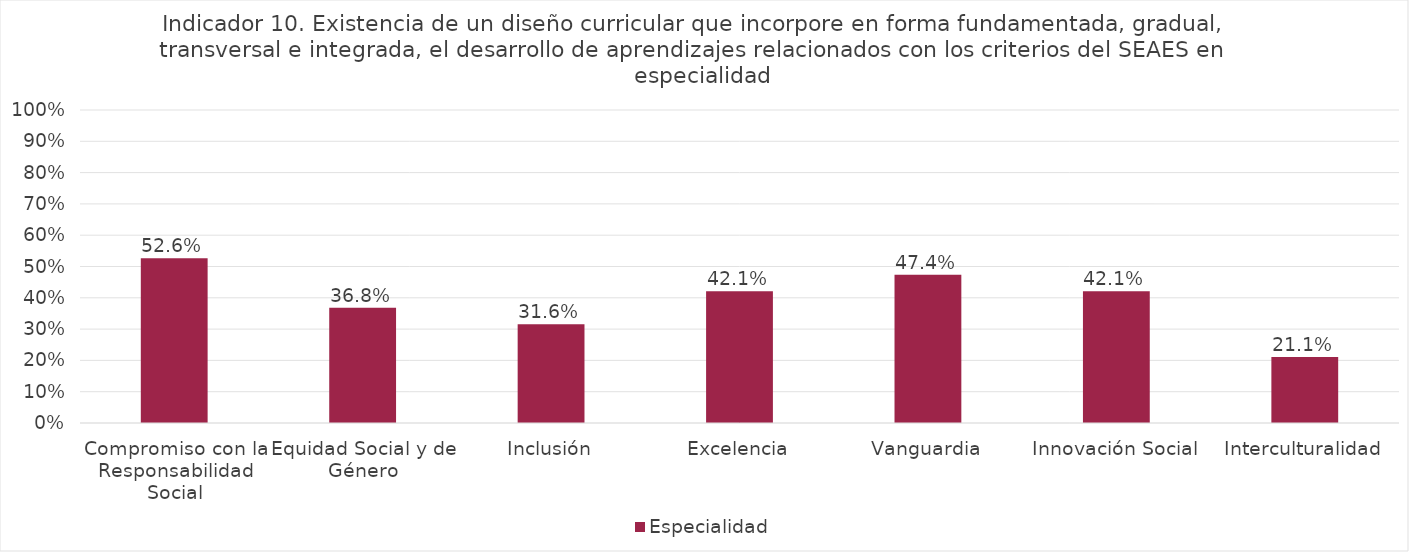
| Category | Especialidad |
|---|---|
| Compromiso con la Responsabilidad Social | 0.526 |
| Equidad Social y de Género | 0.368 |
| Inclusión | 0.316 |
| Excelencia | 0.421 |
| Vanguardia | 0.474 |
| Innovación Social | 0.421 |
| Interculturalidad | 0.211 |